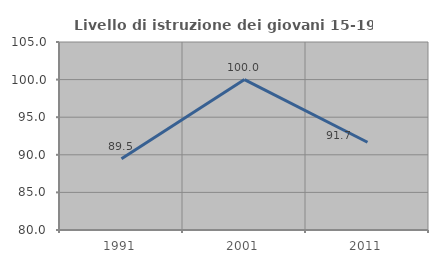
| Category | Livello di istruzione dei giovani 15-19 anni |
|---|---|
| 1991.0 | 89.474 |
| 2001.0 | 100 |
| 2011.0 | 91.667 |